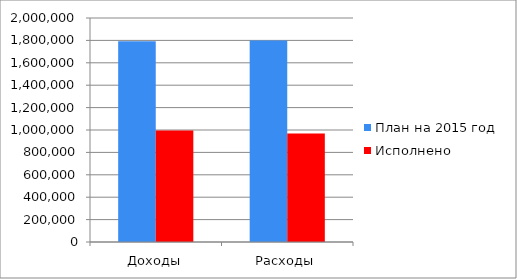
| Category | План на 2015 год | Исполнено  |
|---|---|---|
| Доходы | 1793132 | 995162 |
| Расходы | 1799634 | 968404 |